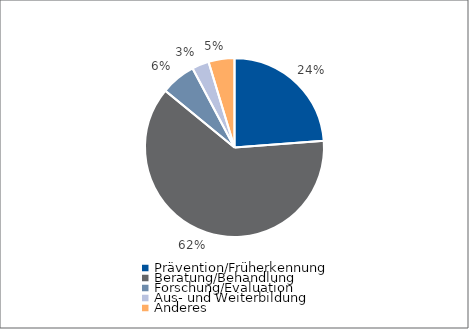
| Category | Series 0 |
|---|---|
| Prävention/Früherkennung | 22873.52 |
| Beratung/Behandlung | 59662.36 |
| Forschung/Evaluation | 6062.2 |
| Aus- und Weiterbildung | 2949.92 |
| Anderes | 4500 |